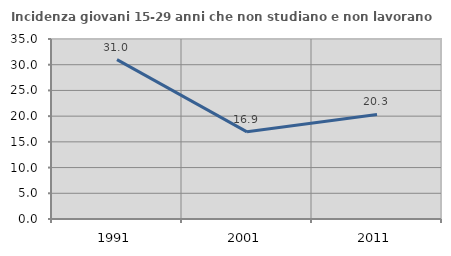
| Category | Incidenza giovani 15-29 anni che non studiano e non lavorano  |
|---|---|
| 1991.0 | 31 |
| 2001.0 | 16.949 |
| 2011.0 | 20.331 |